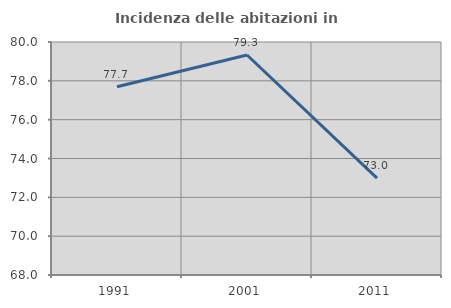
| Category | Incidenza delle abitazioni in proprietà  |
|---|---|
| 1991.0 | 77.695 |
| 2001.0 | 79.331 |
| 2011.0 | 72.987 |